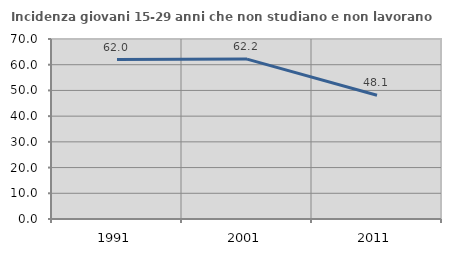
| Category | Incidenza giovani 15-29 anni che non studiano e non lavorano  |
|---|---|
| 1991.0 | 62 |
| 2001.0 | 62.175 |
| 2011.0 | 48.118 |